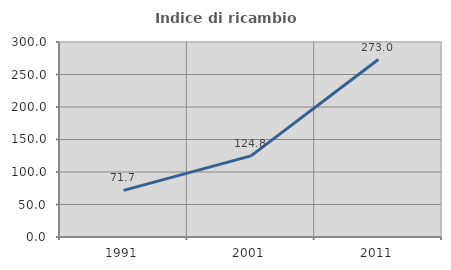
| Category | Indice di ricambio occupazionale  |
|---|---|
| 1991.0 | 71.657 |
| 2001.0 | 124.776 |
| 2011.0 | 272.973 |